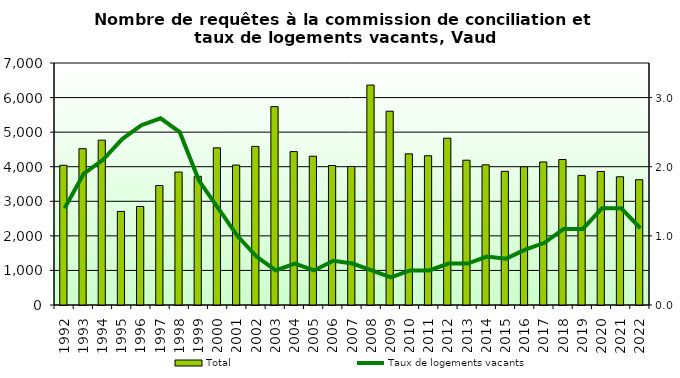
| Category | Total |
|---|---|
| 1992.0 | 4042 |
| 1993.0 | 4522 |
| 1994.0 | 4768 |
| 1995.0 | 2707 |
| 1996.0 | 2849 |
| 1997.0 | 3456 |
| 1998.0 | 3845 |
| 1999.0 | 3724 |
| 2000.0 | 4545 |
| 2001.0 | 4048 |
| 2002.0 | 4588 |
| 2003.0 | 5738 |
| 2004.0 | 4437 |
| 2005.0 | 4304 |
| 2006.0 | 4035 |
| 2007.0 | 4005 |
| 2008.0 | 6362 |
| 2009.0 | 5605 |
| 2010.0 | 4372 |
| 2011.0 | 4318 |
| 2012.0 | 4824 |
| 2013.0 | 4188 |
| 2014.0 | 4054 |
| 2015.0 | 3866 |
| 2016.0 | 3998 |
| 2017.0 | 4138 |
| 2018.0 | 4209 |
| 2019.0 | 3749 |
| 2020.0 | 3862 |
| 2021.0 | 3709 |
| 2022.0 | 3624 |